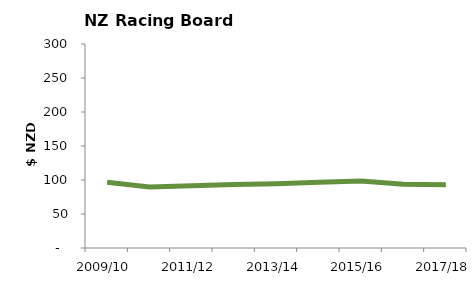
| Category | Inflation adjusted expenditure per capita |
|---|---|
| 2009/10 | 96.661 |
| 2010/11 | 89.655 |
| 2011/12 | 91.426 |
| 2012/13 | 93.203 |
| 2013/14 | 94.506 |
| 2014/15 | 96.736 |
| 2015/16 | 98.365 |
| 2016/17 | 93.774 |
| 2017/18 | 93.114 |